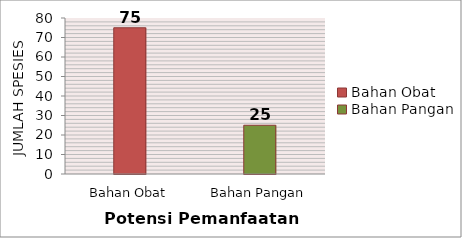
| Category | Potensi Pemafaatan |
|---|---|
| Bahan Obat | 75 |
| Bahan Pangan | 25 |